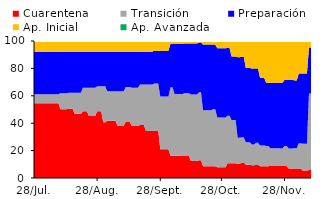
| Category | Cuarentena | Transición | Preparación | Ap. Inicial | Ap. Avanzada |
|---|---|---|---|---|---|
| 2020-07-28 | 54.523 | 6.599 | 31.028 | 7.85 | 0 |
| 2020-07-29 | 54.523 | 6.599 | 31.028 | 7.85 | 0 |
| 2020-07-30 | 54.523 | 6.599 | 31.028 | 7.85 | 0 |
| 2020-07-31 | 54.523 | 6.599 | 31.028 | 7.85 | 0 |
| 2020-08-01 | 54.523 | 6.599 | 31.028 | 7.85 | 0 |
| 2020-08-02 | 54.523 | 6.599 | 31.028 | 7.85 | 0 |
| 2020-08-03 | 54.523 | 6.599 | 31.028 | 7.85 | 0 |
| 2020-08-04 | 54.523 | 6.599 | 31.028 | 7.85 | 0 |
| 2020-08-05 | 54.523 | 6.599 | 31.028 | 7.85 | 0 |
| 2020-08-06 | 54.523 | 6.599 | 31.028 | 7.85 | 0 |
| 2020-08-07 | 54.523 | 6.599 | 31.028 | 7.85 | 0 |
| 2020-08-08 | 54.523 | 6.599 | 31.028 | 7.85 | 0 |
| 2020-08-09 | 54.523 | 6.599 | 31.028 | 7.85 | 0 |
| 2020-08-10 | 50.216 | 11.71 | 30.224 | 7.85 | 0 |
| 2020-08-11 | 50.216 | 11.71 | 30.224 | 7.85 | 0 |
| 2020-08-12 | 50.216 | 11.71 | 30.224 | 7.85 | 0 |
| 2020-08-13 | 50.216 | 11.71 | 30.224 | 7.85 | 0 |
| 2020-08-14 | 50.476 | 11.71 | 29.964 | 7.85 | 0 |
| 2020-08-15 | 50.476 | 11.71 | 29.964 | 7.85 | 0 |
| 2020-08-16 | 50.476 | 11.71 | 29.964 | 7.85 | 0 |
| 2020-08-17 | 46.827 | 15.358 | 29.964 | 7.85 | 0 |
| 2020-08-18 | 46.827 | 15.358 | 29.964 | 7.85 | 0 |
| 2020-08-19 | 46.827 | 15.358 | 29.964 | 7.85 | 0 |
| 2020-08-20 | 46.827 | 15.358 | 29.964 | 7.85 | 0 |
| 2020-08-21 | 48.738 | 17.166 | 26.246 | 7.85 | 0 |
| 2020-08-22 | 48.738 | 17.166 | 26.246 | 7.85 | 0 |
| 2020-08-23 | 48.738 | 17.166 | 26.246 | 7.85 | 0 |
| 2020-08-24 | 45.18 | 20.724 | 26.24 | 7.855 | 0 |
| 2020-08-25 | 45.18 | 20.724 | 26.24 | 7.855 | 0 |
| 2020-08-26 | 45.18 | 20.724 | 26.24 | 7.855 | 0 |
| 2020-08-27 | 45.18 | 20.724 | 26.24 | 7.855 | 0 |
| 2020-08-28 | 48.705 | 18.187 | 25.252 | 7.855 | 0 |
| 2020-08-29 | 48.705 | 18.187 | 25.252 | 7.855 | 0 |
| 2020-08-30 | 48.705 | 18.187 | 25.252 | 7.855 | 0 |
| 2020-08-31 | 40.609 | 26.283 | 25.252 | 7.855 | 0 |
| 2020-09-01 | 40.609 | 26.283 | 25.252 | 7.855 | 0 |
| 2020-09-02 | 41.822 | 21.442 | 28.88 | 7.855 | 0 |
| 2020-09-03 | 41.822 | 21.442 | 28.88 | 7.855 | 0 |
| 2020-09-04 | 41.822 | 21.442 | 28.88 | 7.855 | 0 |
| 2020-09-05 | 41.822 | 21.442 | 28.88 | 7.855 | 0 |
| 2020-09-06 | 41.822 | 21.442 | 28.88 | 7.855 | 0 |
| 2020-09-07 | 38.039 | 25.225 | 28.88 | 7.855 | 0 |
| 2020-09-08 | 38.039 | 25.225 | 28.88 | 7.855 | 0 |
| 2020-09-09 | 38.039 | 25.225 | 28.88 | 7.855 | 0 |
| 2020-09-10 | 38.039 | 25.225 | 28.88 | 7.855 | 0 |
| 2020-09-11 | 41.212 | 25.225 | 25.708 | 7.855 | 0 |
| 2020-09-12 | 41.212 | 25.225 | 25.708 | 7.855 | 0 |
| 2020-09-13 | 41.212 | 25.225 | 25.708 | 7.855 | 0 |
| 2020-09-14 | 37.975 | 27.946 | 26.223 | 7.855 | 0 |
| 2020-09-15 | 37.975 | 27.946 | 26.223 | 7.855 | 0 |
| 2020-09-16 | 37.975 | 27.946 | 26.223 | 7.855 | 0 |
| 2020-09-17 | 37.975 | 27.946 | 26.223 | 7.855 | 0 |
| 2020-09-18 | 38.624 | 29.567 | 23.954 | 7.855 | 0 |
| 2020-09-19 | 38.624 | 29.567 | 23.954 | 7.855 | 0 |
| 2020-09-20 | 38.624 | 29.567 | 23.954 | 7.855 | 0 |
| 2020-09-21 | 34.229 | 33.961 | 23.954 | 7.855 | 0 |
| 2020-09-22 | 34.229 | 33.961 | 23.954 | 7.855 | 0 |
| 2020-09-23 | 34.229 | 33.961 | 23.954 | 7.855 | 0 |
| 2020-09-24 | 34.229 | 33.961 | 23.954 | 7.855 | 0 |
| 2020-09-25 | 34.725 | 34.237 | 23.954 | 7.084 | 0 |
| 2020-09-26 | 34.725 | 34.237 | 23.954 | 7.084 | 0 |
| 2020-09-27 | 34.725 | 34.237 | 23.954 | 7.084 | 0 |
| 2020-09-28 | 21.045 | 38.479 | 33.392 | 7.084 | 0 |
| 2020-09-29 | 21.045 | 38.479 | 33.392 | 7.084 | 0 |
| 2020-09-30 | 21.045 | 38.479 | 33.392 | 7.084 | 0 |
| 2020-10-01 | 21.045 | 38.479 | 33.392 | 7.084 | 0 |
| 2020-10-02 | 21.045 | 38.479 | 33.392 | 7.084 | 0 |
| 2020-10-03 | 16.293 | 49.9 | 31.672 | 2.135 | 0 |
| 2020-10-04 | 16.293 | 49.9 | 31.672 | 2.135 | 0 |
| 2020-10-05 | 16.293 | 45.045 | 36.527 | 2.135 | 0 |
| 2020-10-06 | 16.293 | 45.045 | 36.527 | 2.135 | 0 |
| 2020-10-07 | 16.293 | 45.045 | 36.527 | 2.135 | 0 |
| 2020-10-08 | 16.337 | 45.001 | 36.527 | 2.135 | 0 |
| 2020-10-09 | 16.337 | 45.001 | 36.527 | 2.135 | 0 |
| 2020-10-10 | 16.494 | 45.479 | 36.18 | 1.847 | 0 |
| 2020-10-11 | 16.494 | 45.479 | 36.18 | 1.847 | 0 |
| 2020-10-12 | 16.494 | 45.479 | 36.18 | 1.847 | 0 |
| 2020-10-13 | 12.472 | 48.48 | 37.201 | 1.847 | 0 |
| 2020-10-14 | 12.472 | 48.48 | 37.201 | 1.847 | 0 |
| 2020-10-15 | 12.472 | 48.48 | 37.201 | 1.847 | 0 |
| 2020-10-16 | 12.472 | 48.48 | 37.201 | 1.847 | 0 |
| 2020-10-17 | 12.973 | 49.535 | 36.399 | 1.093 | 0 |
| 2020-10-18 | 12.973 | 49.535 | 36.399 | 1.093 | 0 |
| 2020-10-19 | 8.537 | 40.929 | 47.923 | 2.612 | 0 |
| 2020-10-20 | 8.537 | 40.929 | 47.923 | 2.612 | 0 |
| 2020-10-21 | 8.537 | 40.929 | 47.923 | 2.612 | 0 |
| 2020-10-22 | 8.537 | 40.929 | 47.923 | 2.612 | 0 |
| 2020-10-23 | 8.537 | 40.929 | 47.923 | 2.612 | 0 |
| 2020-10-24 | 8.537 | 41.705 | 47.146 | 2.612 | 0 |
| 2020-10-25 | 8.537 | 41.705 | 47.146 | 2.612 | 0 |
| 2020-10-26 | 7.846 | 36.245 | 50.591 | 5.317 | 0 |
| 2020-10-27 | 7.846 | 36.245 | 50.591 | 5.317 | 0 |
| 2020-10-28 | 7.846 | 36.245 | 50.591 | 5.317 | 0 |
| 2020-10-29 | 7.846 | 36.245 | 50.591 | 5.317 | 0 |
| 2020-10-30 | 7.846 | 36.245 | 50.591 | 5.317 | 0 |
| 2020-10-31 | 10.814 | 34.61 | 49.523 | 5.052 | 0 |
| 2020-11-01 | 10.814 | 34.61 | 49.523 | 5.052 | 0 |
| 2020-11-02 | 10.759 | 31.489 | 46.39 | 11.363 | 0 |
| 2020-11-03 | 10.759 | 31.489 | 46.39 | 11.363 | 0 |
| 2020-11-04 | 10.759 | 31.489 | 46.39 | 11.363 | 0 |
| 2020-11-05 | 10.193 | 19.199 | 58.788 | 11.82 | 0 |
| 2020-11-06 | 10.193 | 19.199 | 58.788 | 11.82 | 0 |
| 2020-11-07 | 11.39 | 18.306 | 58.788 | 11.517 | 0 |
| 2020-11-08 | 11.39 | 18.306 | 58.788 | 11.517 | 0 |
| 2020-11-09 | 9.75 | 16.381 | 54.149 | 19.72 | 0 |
| 2020-11-10 | 9.75 | 16.381 | 54.149 | 19.72 | 0 |
| 2020-11-11 | 9.75 | 16.381 | 54.149 | 19.72 | 0 |
| 2020-11-12 | 9.296 | 15.131 | 55.428 | 20.146 | 0 |
| 2020-11-13 | 9.296 | 15.131 | 55.428 | 20.146 | 0 |
| 2020-11-14 | 9.564 | 16.227 | 54.063 | 20.146 | 0 |
| 2020-11-15 | 9.564 | 16.227 | 54.063 | 20.146 | 0 |
| 2020-11-16 | 8.637 | 15.068 | 49.413 | 26.882 | 0 |
| 2020-11-17 | 8.637 | 15.068 | 49.413 | 26.882 | 0 |
| 2020-11-18 | 8.637 | 15.068 | 49.413 | 26.882 | 0 |
| 2020-11-19 | 8.599 | 14.826 | 46.045 | 30.53 | 0 |
| 2020-11-20 | 8.599 | 14.826 | 46.045 | 30.53 | 0 |
| 2020-11-21 | 8.755 | 12.973 | 47.833 | 30.44 | 0 |
| 2020-11-22 | 8.755 | 12.973 | 47.833 | 30.44 | 0 |
| 2020-11-23 | 8.755 | 12.973 | 47.833 | 30.44 | 0 |
| 2020-11-24 | 8.755 | 12.973 | 47.833 | 30.44 | 0 |
| 2020-11-25 | 8.755 | 12.973 | 47.833 | 30.44 | 0 |
| 2020-11-26 | 8.755 | 12.857 | 47.949 | 30.44 | 0 |
| 2020-11-27 | 8.755 | 12.857 | 47.949 | 30.44 | 0 |
| 2020-11-28 | 8.831 | 14.583 | 48.175 | 28.411 | 0 |
| 2020-11-29 | 8.831 | 14.583 | 48.175 | 28.411 | 0 |
| 2020-11-30 | 6.857 | 14.719 | 50.012 | 28.411 | 0 |
| 2020-12-01 | 6.857 | 14.719 | 50.012 | 28.411 | 0 |
| 2020-12-02 | 6.857 | 14.719 | 50.012 | 28.411 | 0 |
| 2020-12-03 | 6.868 | 14.863 | 49.516 | 28.752 | 0 |
| 2020-12-04 | 6.868 | 14.863 | 49.516 | 28.752 | 0 |
| 2020-12-05 | 6.868 | 18.423 | 50.926 | 23.782 | 0 |
| 2020-12-06 | 6.868 | 18.423 | 50.926 | 23.782 | 0 |
| 2020-12-07 | 5.392 | 19.663 | 51.162 | 23.782 | 0 |
| 2020-12-08 | 5.392 | 19.663 | 51.162 | 23.782 | 0 |
| 2020-12-09 | 5.392 | 19.663 | 51.162 | 23.782 | 0 |
| 2020-12-10 | 5.928 | 55.694 | 33.687 | 4.691 | 0 |
| 2020-12-11 | 5.928 | 55.694 | 33.687 | 4.691 | 0 |